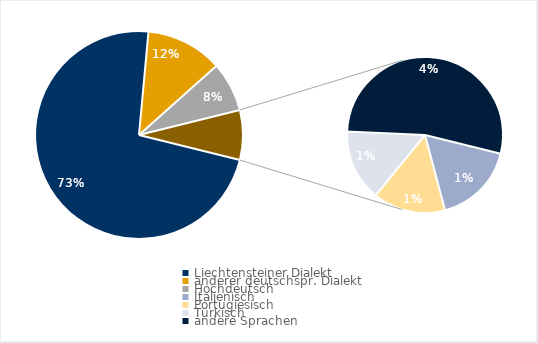
| Category | Series 0 |
|---|---|
| Liechtensteiner Dialekt | 0.726 |
| anderer deutschspr. Dialekt | 0.119 |
| Hochdeutsch | 0.077 |
| Italienisch | 0.013 |
| Portugiesisch | 0.012 |
| Türkisch | 0.011 |
| andere Sprachen | 0.041 |